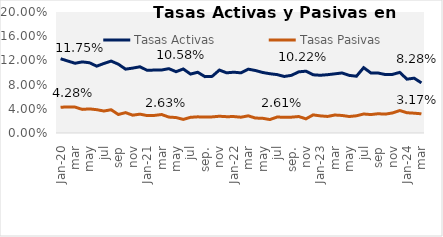
| Category | Tasas Activas | Tasas Pasivas |
|---|---|---|
| ene-20 | 0.123 | 0.043 |
| feb | 0.119 | 0.043 |
| mar | 0.115 | 0.043 |
| abr | 0.118 | 0.039 |
| may | 0.116 | 0.04 |
| jun | 0.11 | 0.039 |
| jul | 0.115 | 0.036 |
| ago | 0.119 | 0.038 |
| sep | 0.114 | 0.031 |
| oct | 0.106 | 0.034 |
| nov | 0.107 | 0.029 |
| dic | 0.109 | 0.031 |
| ene-21 | 0.104 | 0.029 |
| feb | 0.104 | 0.029 |
| mar | 0.104 | 0.031 |
| abr | 0.106 | 0.026 |
| may | 0.101 | 0.026 |
| jun | 0.106 | 0.022 |
| jul | 0.097 | 0.026 |
| ago | 0.1 | 0.027 |
| sep. | 0.093 | 0.026 |
| oct. | 0.094 | 0.027 |
| nov | 0.104 | 0.028 |
| dic | 0.099 | 0.027 |
| ene-22 | 0.1 | 0.027 |
| feb | 0.099 | 0.026 |
| mar | 0.106 | 0.028 |
| apr | 0.103 | 0.025 |
| may | 0.1 | 0.024 |
| Jun | 0.098 | 0.022 |
| jul | 0.097 | 0.026 |
| ago | 0.093 | 0.026 |
| sep. | 0.095 | 0.026 |
| oct | 0.101 | 0.027 |
| nov | 0.102 | 0.023 |
| dic | 0.096 | 0.03 |
| ene-23 | 0.095 | 0.028 |
| feb | 0.096 | 0.027 |
| mar | 0.098 | 0.03 |
| abr | 0.099 | 0.029 |
| may | 0.095 | 0.027 |
| jun | 0.094 | 0.028 |
| jul | 0.108 | 0.031 |
| ago | 0.099 | 0.03 |
| sep | 0.099 | 0.032 |
| oct | 0.097 | 0.031 |
| nov | 0.097 | 0.033 |
| dic | 0.1 | 0.037 |
| ene-24 | 0.089 | 0.033 |
| feb | 0.091 | 0.033 |
| mar | 0.083 | 0.032 |